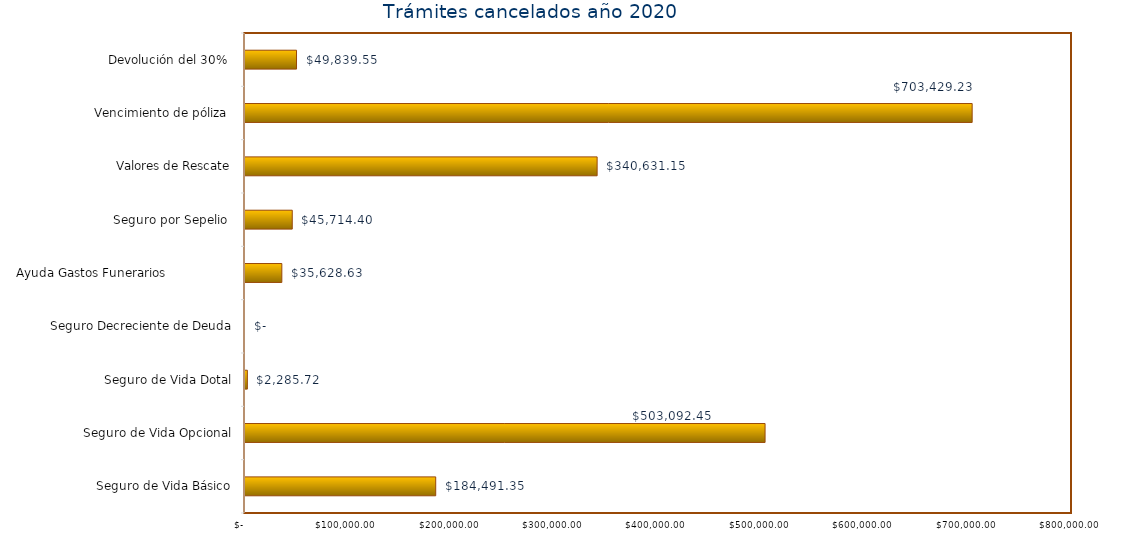
| Category | Monto  |
|---|---|
| Seguro de Vida Básico | 184491.35 |
| Seguro de Vida Opcional | 503092.45 |
| Seguro de Vida Dotal | 2285.72 |
| Seguro Decreciente de Deuda | 0 |
| Ayuda Gastos Funerarios                  | 35628.63 |
| Seguro por Sepelio  | 45714.4 |
| Valores de Rescate | 340631.15 |
| Vencimiento de póliza  | 703429.23 |
| Devolución del 30%  | 49839.55 |